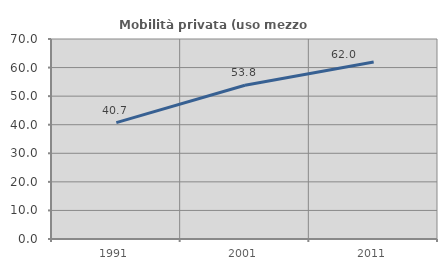
| Category | Mobilità privata (uso mezzo privato) |
|---|---|
| 1991.0 | 40.727 |
| 2001.0 | 53.835 |
| 2011.0 | 61.96 |